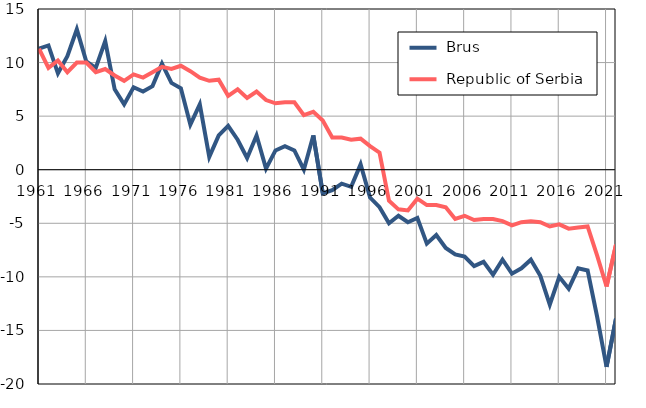
| Category |  Brus |  Republic of Serbia |
|---|---|---|
| 1961.0 | 11.3 | 11.3 |
| 1962.0 | 11.6 | 9.5 |
| 1963.0 | 9 | 10.2 |
| 1964.0 | 10.6 | 9.1 |
| 1965.0 | 13.1 | 10 |
| 1966.0 | 10.1 | 10 |
| 1967.0 | 9.5 | 9.1 |
| 1968.0 | 12 | 9.4 |
| 1969.0 | 7.5 | 8.8 |
| 1970.0 | 6.1 | 8.3 |
| 1971.0 | 7.7 | 8.9 |
| 1972.0 | 7.3 | 8.6 |
| 1973.0 | 7.8 | 9.1 |
| 1974.0 | 9.9 | 9.6 |
| 1975.0 | 8.1 | 9.4 |
| 1976.0 | 7.6 | 9.7 |
| 1977.0 | 4.2 | 9.2 |
| 1978.0 | 6.1 | 8.6 |
| 1979.0 | 1.2 | 8.3 |
| 1980.0 | 3.2 | 8.4 |
| 1981.0 | 4.1 | 6.9 |
| 1982.0 | 2.8 | 7.5 |
| 1983.0 | 1.1 | 6.7 |
| 1984.0 | 3.2 | 7.3 |
| 1985.0 | 0.1 | 6.5 |
| 1986.0 | 1.8 | 6.2 |
| 1987.0 | 2.2 | 6.3 |
| 1988.0 | 1.8 | 6.3 |
| 1989.0 | 0 | 5.1 |
| 1990.0 | 3.2 | 5.4 |
| 1991.0 | -2.2 | 4.6 |
| 1992.0 | -1.9 | 3 |
| 1993.0 | -1.3 | 3 |
| 1994.0 | -1.6 | 2.8 |
| 1995.0 | 0.5 | 2.9 |
| 1996.0 | -2.6 | 2.2 |
| 1997.0 | -3.5 | 1.6 |
| 1998.0 | -5 | -2.9 |
| 1999.0 | -4.3 | -3.7 |
| 2000.0 | -4.9 | -3.8 |
| 2001.0 | -4.5 | -2.7 |
| 2002.0 | -6.9 | -3.3 |
| 2003.0 | -6.1 | -3.3 |
| 2004.0 | -7.3 | -3.5 |
| 2005.0 | -7.9 | -4.6 |
| 2006.0 | -8.1 | -4.3 |
| 2007.0 | -9 | -4.7 |
| 2008.0 | -8.6 | -4.6 |
| 2009.0 | -9.8 | -4.6 |
| 2010.0 | -8.4 | -4.8 |
| 2011.0 | -9.7 | -5.2 |
| 2012.0 | -9.2 | -4.9 |
| 2013.0 | -8.4 | -4.8 |
| 2014.0 | -9.9 | -4.9 |
| 2015.0 | -12.6 | -5.3 |
| 2016.0 | -10 | -5.1 |
| 2017.0 | -11.1 | -5.5 |
| 2018.0 | -9.2 | -5.4 |
| 2019.0 | -9.4 | -5.3 |
| 2020.0 | -13.7 | -8 |
| 2021.0 | -18.4 | -10.9 |
| 2022.0 | -13.9 | -7 |